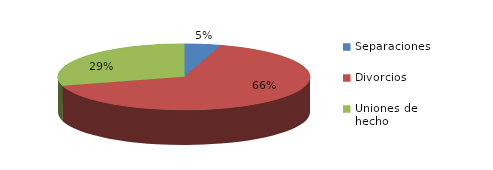
| Category | Series 0 |
|---|---|
| Separaciones | 66 |
| Divorcios | 925 |
| Uniones de hecho | 413 |